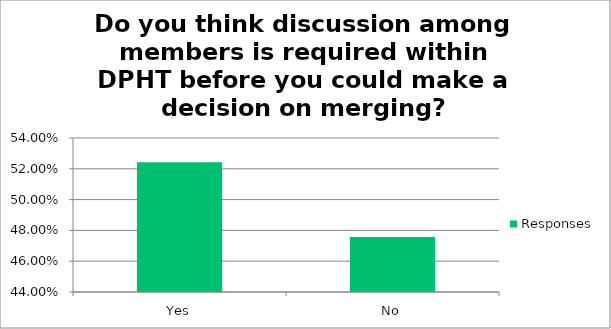
| Category | Responses |
|---|---|
| Yes | 0.524 |
| No | 0.476 |